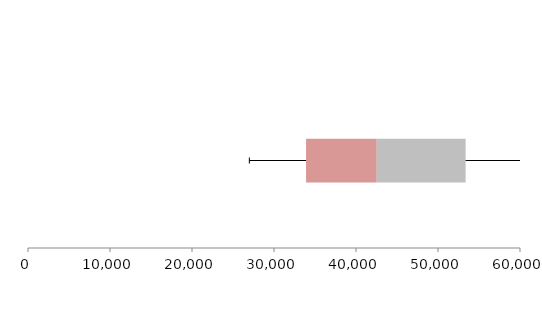
| Category | Series 1 | Series 2 | Series 3 |
|---|---|---|---|
| 0 | 33912.173 | 8617.774 | 10838.463 |